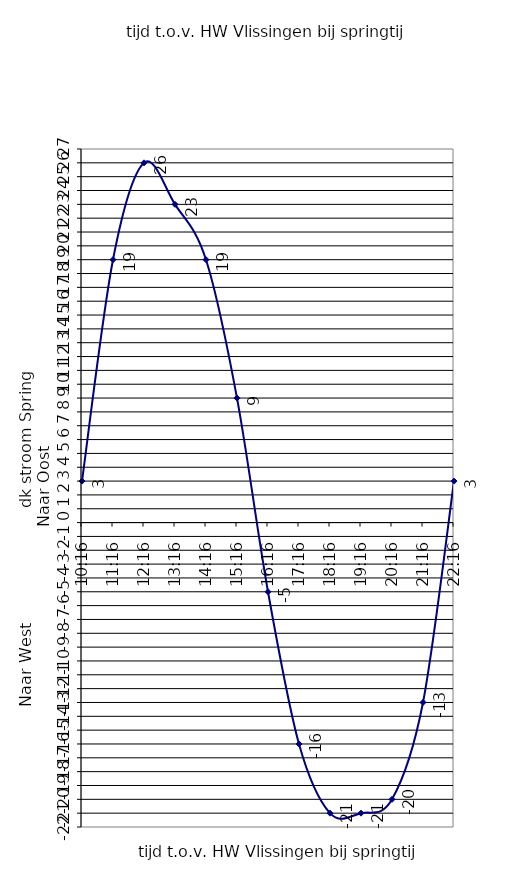
| Category | Series 0 |
|---|---|
| 10:16 | 3 |
| 11:16 | 19 |
| 12:16 | 26 |
| 13:16 | 23 |
| 14:16 | 19 |
| 15:16 | 9 |
| 0.6777777777777778 | -5 |
| 17:16 | -16 |
| 18:16 | -21 |
| 19:16 | -21 |
| 20:16 | -20 |
| 21:16 | -13 |
| 22:16 | 3 |